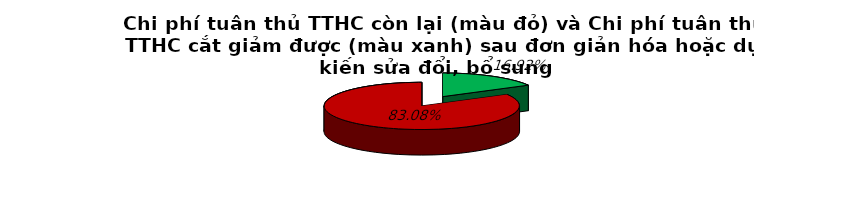
| Category | 16.9% 83.1% |
|---|---|
| 0 | 0.169 |
| 1 | 0.831 |